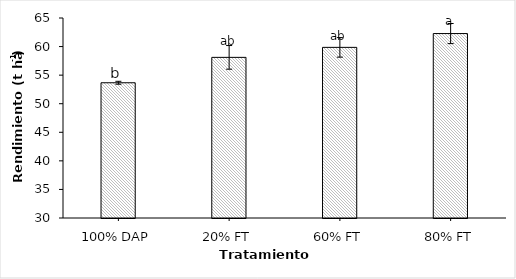
| Category | REN |
|---|---|
| 100% DAP | 53.667 |
| 20% FT | 58.111 |
| 60% FT | 59.861 |
| 80% FT | 62.278 |